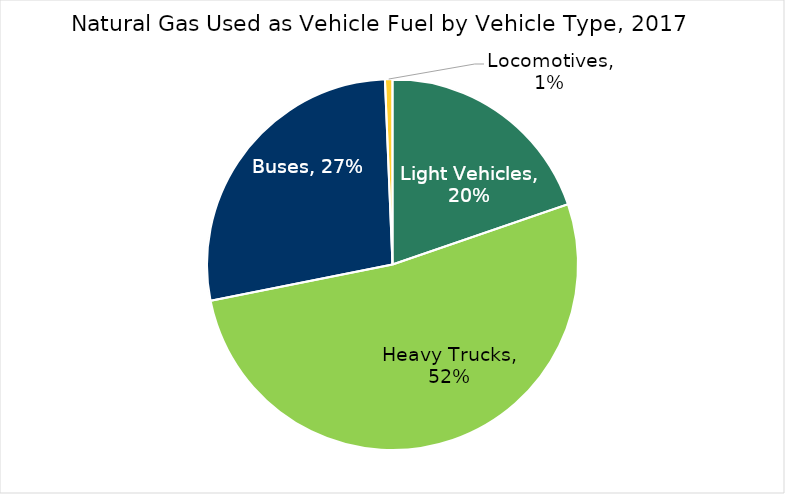
| Category | Series 0 |
|---|---|
| Light Vehicles | 0.197 |
| Heavy Trucks | 0.521 |
| Buses | 0.275 |
| Locomotives | 0.007 |